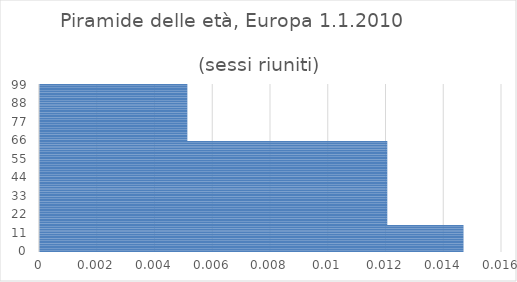
| Category | Series 0 |
|---|---|
| 0.0 | 0.015 |
| 1.0 | 0.015 |
| 2.0 | 0.015 |
| 3.0 | 0.015 |
| 4.0 | 0.015 |
| 5.0 | 0.015 |
| 6.0 | 0.015 |
| 7.0 | 0.015 |
| 8.0 | 0.015 |
| 9.0 | 0.015 |
| 10.0 | 0.015 |
| 11.0 | 0.015 |
| 12.0 | 0.015 |
| 13.0 | 0.015 |
| 14.0 | 0.015 |
| 15.0 | 0.015 |
| 16.0 | 0.012 |
| 17.0 | 0.012 |
| 18.0 | 0.012 |
| 19.0 | 0.012 |
| 20.0 | 0.012 |
| 21.0 | 0.012 |
| 22.0 | 0.012 |
| 23.0 | 0.012 |
| 24.0 | 0.012 |
| 25.0 | 0.012 |
| 26.0 | 0.012 |
| 27.0 | 0.012 |
| 28.0 | 0.012 |
| 29.0 | 0.012 |
| 30.0 | 0.012 |
| 31.0 | 0.012 |
| 32.0 | 0.012 |
| 33.0 | 0.012 |
| 34.0 | 0.012 |
| 35.0 | 0.012 |
| 36.0 | 0.012 |
| 37.0 | 0.012 |
| 38.0 | 0.012 |
| 39.0 | 0.012 |
| 40.0 | 0.012 |
| 41.0 | 0.012 |
| 42.0 | 0.012 |
| 43.0 | 0.012 |
| 44.0 | 0.012 |
| 45.0 | 0.012 |
| 46.0 | 0.012 |
| 47.0 | 0.012 |
| 48.0 | 0.012 |
| 49.0 | 0.012 |
| 50.0 | 0.012 |
| 51.0 | 0.012 |
| 52.0 | 0.012 |
| 53.0 | 0.012 |
| 54.0 | 0.012 |
| 55.0 | 0.012 |
| 56.0 | 0.012 |
| 57.0 | 0.012 |
| 58.0 | 0.012 |
| 59.0 | 0.012 |
| 60.0 | 0.012 |
| 61.0 | 0.012 |
| 62.0 | 0.012 |
| 63.0 | 0.012 |
| 64.0 | 0.012 |
| 65.0 | 0.012 |
| 66.0 | 0.005 |
| 67.0 | 0.005 |
| 68.0 | 0.005 |
| 69.0 | 0.005 |
| 70.0 | 0.005 |
| 71.0 | 0.005 |
| 72.0 | 0.005 |
| 73.0 | 0.005 |
| 74.0 | 0.005 |
| 75.0 | 0.005 |
| 76.0 | 0.005 |
| 77.0 | 0.005 |
| 78.0 | 0.005 |
| 79.0 | 0.005 |
| 80.0 | 0.005 |
| 81.0 | 0.005 |
| 82.0 | 0.005 |
| 83.0 | 0.005 |
| 84.0 | 0.005 |
| 85.0 | 0.005 |
| 86.0 | 0.005 |
| 87.0 | 0.005 |
| 88.0 | 0.005 |
| 89.0 | 0.005 |
| 90.0 | 0.005 |
| 91.0 | 0.005 |
| 92.0 | 0.005 |
| 93.0 | 0.005 |
| 94.0 | 0.005 |
| 95.0 | 0.005 |
| 96.0 | 0.005 |
| 97.0 | 0.005 |
| 98.0 | 0.005 |
| 99.0 | 0.005 |